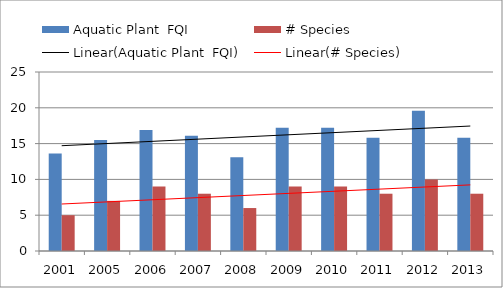
| Category | Aquatic Plant  FQI | # Species |
|---|---|---|
| 2001.0 | 13.6 | 5 |
| 2005.0 | 15.5 | 7 |
| 2006.0 | 16.9 | 9 |
| 2007.0 | 16.1 | 8 |
| 2008.0 | 13.1 | 6 |
| 2009.0 | 17.2 | 9 |
| 2010.0 | 17.2 | 9 |
| 2011.0 | 15.8 | 8 |
| 2012.0 | 19.6 | 10 |
| 2013.0 | 15.8 | 8 |